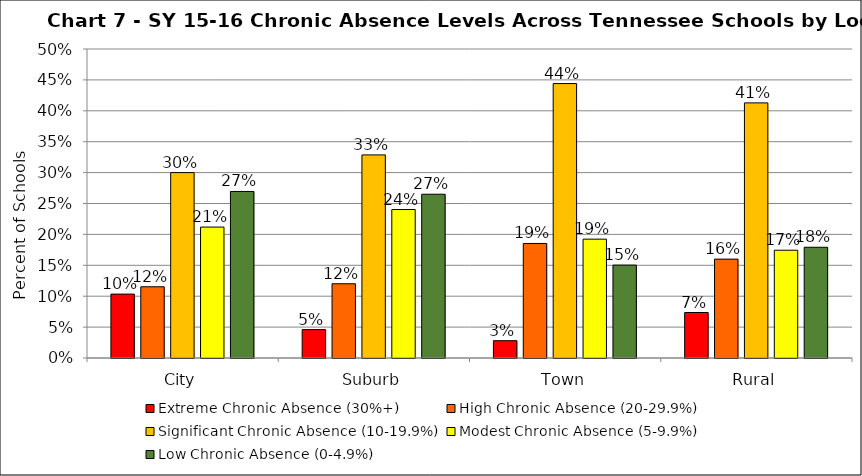
| Category | Extreme Chronic Absence (30%+) | High Chronic Absence (20-29.9%) | Significant Chronic Absence (10-19.9%) | Modest Chronic Absence (5-9.9%) | Low Chronic Absence (0-4.9%) |
|---|---|---|---|---|---|
| 0 | 0.103 | 0.115 | 0.3 | 0.212 | 0.269 |
| 1 | 0.046 | 0.12 | 0.329 | 0.24 | 0.265 |
| 2 | 0.028 | 0.185 | 0.444 | 0.192 | 0.15 |
| 3 | 0.074 | 0.16 | 0.413 | 0.174 | 0.179 |